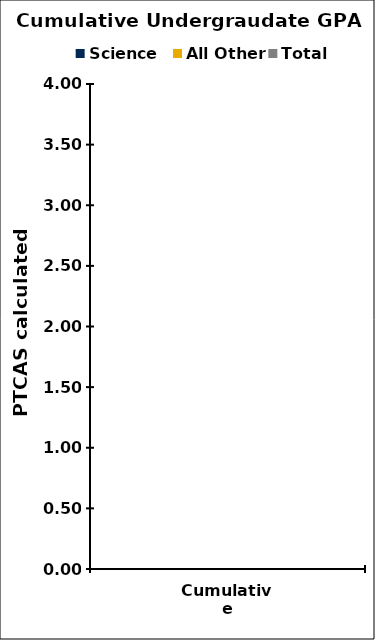
| Category | Science | All Other | Total |
|---|---|---|---|
| Cumulative | 0 | 0 | 0 |